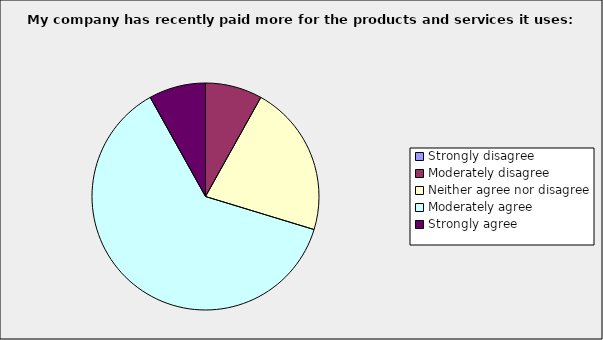
| Category | Series 0 |
|---|---|
| Strongly disagree | 0 |
| Moderately disagree | 0.081 |
| Neither agree nor disagree | 0.216 |
| Moderately agree | 0.622 |
| Strongly agree | 0.081 |